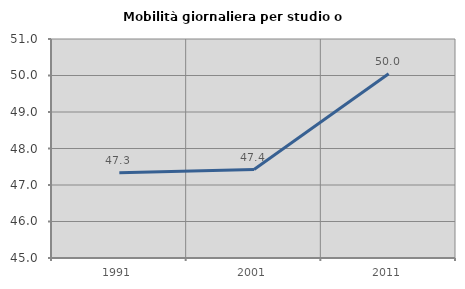
| Category | Mobilità giornaliera per studio o lavoro |
|---|---|
| 1991.0 | 47.334 |
| 2001.0 | 47.424 |
| 2011.0 | 50.046 |